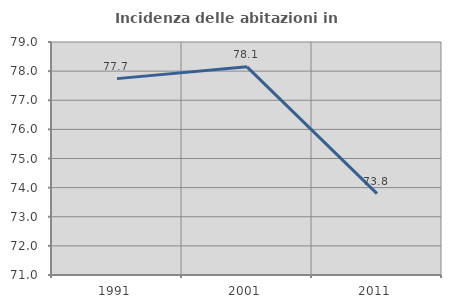
| Category | Incidenza delle abitazioni in proprietà  |
|---|---|
| 1991.0 | 77.742 |
| 2001.0 | 78.147 |
| 2011.0 | 73.794 |